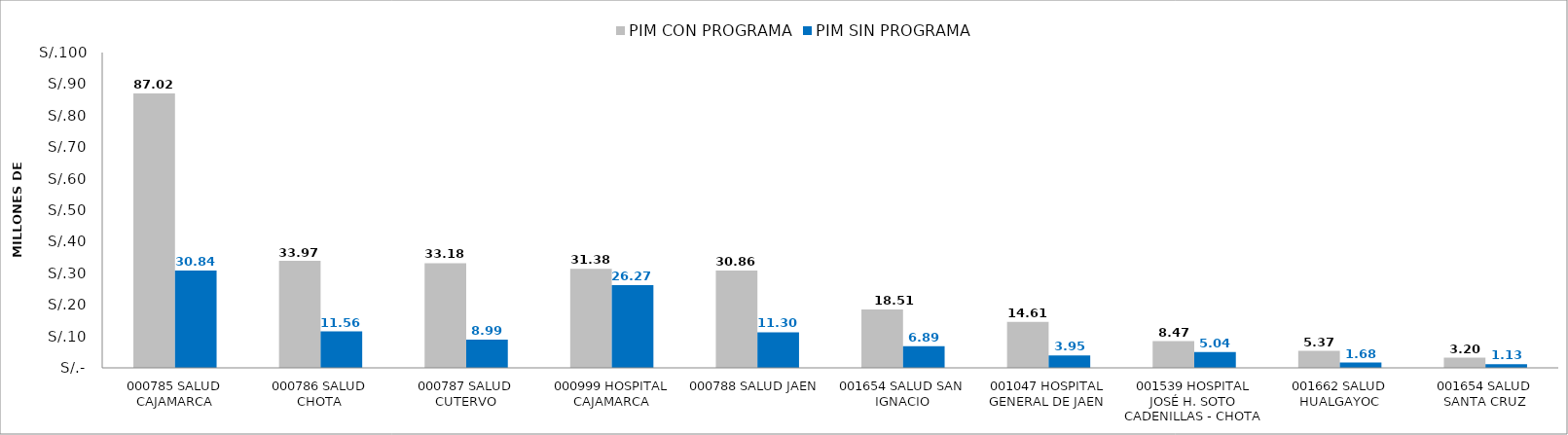
| Category | PIM CON PROGRAMA | PIM SIN PROGRAMA |
|---|---|---|
| 000785 SALUD CAJAMARCA | 87.024 | 30.836 |
| 000786 SALUD CHOTA | 33.969 | 11.561 |
| 000787 SALUD CUTERVO | 33.181 | 8.988 |
| 000999 HOSPITAL CAJAMARCA | 31.379 | 26.265 |
| 000788 SALUD JAEN | 30.862 | 11.304 |
| 001654 SALUD SAN IGNACIO | 18.512 | 6.886 |
| 001047 HOSPITAL GENERAL DE JAEN | 14.608 | 3.948 |
| 001539 HOSPITAL JOSÉ H. SOTO CADENILLAS - CHOTA | 8.471 | 5.043 |
| 001662 SALUD HUALGAYOC | 5.369 | 1.68 |
| 001654 SALUD SANTA CRUZ | 3.204 | 1.13 |